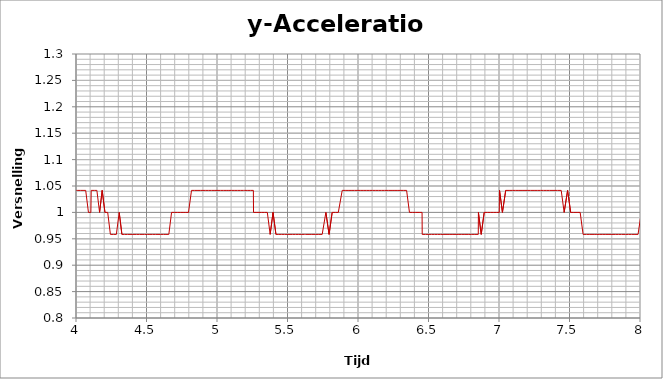
| Category |  y-Acceleration |
|---|---|
| 0.000157 | 1 |
| 0.0130323 | 1 |
| 0.0138545 | 1 |
| 0.0147613 | 1 |
| 0.0156226 | 1 |
| 0.0305647 | 1 |
| 0.0317428 | 1 |
| 0.080701 | 1 |
| 0.0817575 | 1 |
| 0.0826627 | 1 |
| 0.0838849 | 1 |
| 0.1066629 | 1 |
| 0.1076301 | 1 |
| 0.1084358 | 1 |
| 0.1297994 | 1 |
| 0.1304042 | 1 |
| 0.1475201 | 1 |
| 0.1481867 | 1 |
| 0.1748085 | 1 |
| 0.1893385 | 1 |
| 0.2036937 | 1 |
| 0.2206649 | 1.042 |
| 0.2213476 | 1.042 |
| 0.2349119 | 1 |
| 0.2356791 | 1 |
| 0.2512288 | 1 |
| 0.2674596 | 1 |
| 0.2817003 | 1 |
| 0.282387 | 1 |
| 0.2986292 | 1.042 |
| 0.2994668 | 1.042 |
| 0.3148453 | 1 |
| 0.3303498 | 1 |
| 0.3310177 | 1 |
| 0.3447499 | 0.958 |
| 0.3591618 | 1 |
| 0.3598312 | 1 |
| 0.374069 | 1 |
| 0.3896296 | 1 |
| 0.3902931 | 1 |
| 0.4042918 | 1 |
| 0.4211725 | 1 |
| 0.4371692 | 1 |
| 0.4378536 | 1 |
| 0.45218 | 1 |
| 0.4527916 | 1 |
| 0.4707061 | 1 |
| 0.4854508 | 0.958 |
| 0.4860869 | 0.958 |
| 0.500232 | 1 |
| 0.51593 | 1 |
| 0.5165812 | 1 |
| 0.5309185 | 1 |
| 0.5454933 | 1 |
| 0.5461828 | 1 |
| 0.5617739 | 1 |
| 0.5764766 | 1 |
| 0.5770758 | 1 |
| 0.5933145 | 1.042 |
| 0.5944557 | 1.042 |
| 0.6133145 | 1 |
| 0.6165906 | 1 |
| 0.6308497 | 1 |
| 0.6454278 | 1 |
| 0.6461086 | 1 |
| 0.6602964 | 1 |
| 0.6770583 | 1 |
| 0.6918479 | 1 |
| 0.6926751 | 1 |
| 0.7075005 | 1 |
| 0.7218467 | 1 |
| 0.722546 | 1 |
| 0.741728 | 1 |
| 0.7603823 | 1 |
| 0.7611727 | 1 |
| 0.778845 | 1 |
| 0.7795004 | 1 |
| 0.7970225 | 1 |
| 0.8128809 | 1 |
| 0.813536 | 1 |
| 0.8292187 | 1 |
| 0.8298403 | 1 |
| 0.8468428 | 1 |
| 0.8475012 | 1 |
| 0.8644892 | 1.042 |
| 0.8839321 | 1 |
| 0.8998428 | 1 |
| 0.9004683 | 1 |
| 0.9173861 | 1 |
| 0.9180443 | 1 |
| 0.9186312 | 1 |
| 0.9365254 | 1 |
| 0.9538486 | 1 |
| 0.9714944 | 1 |
| 0.97215 | 1 |
| 0.9726741 | 1 |
| 0.9887284 | 1 |
| 1.004109 | 1 |
| 1.004833 | 1 |
| 1.019539 | 1 |
| 1.039704 | 1 |
| 1.055128 | 1 |
| 1.055827 | 1 |
| 1.072471 | 1 |
| 1.073161 | 1 |
| 1.087608 | 1.042 |
| 1.103411 | 1.125 |
| 1.104345 | 1.042 |
| 1.119944 | 1 |
| 1.120658 | 1 |
| 1.138724 | 0.833 |
| 1.15358 | 0.792 |
| 1.154357 | 0.792 |
| 1.16973 | 0.875 |
| 1.184896 | 1.042 |
| 1.185607 | 1.042 |
| 1.200219 | 1 |
| 1.215095 | 0.958 |
| 1.215933 | 0.958 |
| 1.232623 | 1 |
| 1.248011 | 1.042 |
| 1.248747 | 1.042 |
| 1.263709 | 0.958 |
| 1.280249 | 0.833 |
| 1.280929 | 0.833 |
| 1.297589 | 0.875 |
| 1.298311 | 0.875 |
| 1.313588 | 1 |
| 1.328605 | 1.042 |
| 1.347488 | 1.083 |
| 1.348127 | 1.083 |
| 1.364383 | 1.083 |
| 1.416748 | 1 |
| 1.417552 | 1 |
| 1.418429 | 1 |
| 1.418986 | 1 |
| 1.41978 | 0.958 |
| 1.444026 | 1 |
| 1.461211 | 1.042 |
| 1.461885 | 1.042 |
| 1.477198 | 1 |
| 1.493001 | 1 |
| 1.493661 | 1 |
| 1.510857 | 1.083 |
| 1.511567 | 1.083 |
| 1.527287 | 1.083 |
| 1.544806 | 1.083 |
| 1.54545 | 1.083 |
| 1.562417 | 1.083 |
| 1.563148 | 1.083 |
| 1.578958 | 1.042 |
| 1.579871 | 1.042 |
| 1.596834 | 1 |
| 1.612385 | 1 |
| 1.61308 | 1 |
| 1.62893 | 1 |
| 1.646513 | 1.042 |
| 1.647231 | 1.042 |
| 1.66569 | 1.083 |
| 1.666421 | 1.083 |
| 1.68415 | 1.125 |
| 1.684872 | 1.125 |
| 1.701502 | 1.083 |
| 1.717536 | 1.083 |
| 1.718264 | 1.083 |
| 1.733546 | 1.125 |
| 1.749707 | 1.042 |
| 1.75034 | 1.042 |
| 1.768749 | 1.042 |
| 1.769474 | 1.042 |
| 1.78447 | 1.042 |
| 1.785323 | 1.042 |
| 1.800751 | 1.042 |
| 1.818138 | 1.042 |
| 1.818774 | 1.042 |
| 1.842808 | 1.042 |
| 1.844419 | 1.042 |
| 1.860927 | 1.083 |
| 1.861655 | 1.083 |
| 1.877919 | 1.042 |
| 1.894364 | 1.042 |
| 1.911796 | 1 |
| 1.912527 | 1 |
| 1.928363 | 1 |
| 1.928998 | 1 |
| 1.94464 | 1 |
| 1.960958 | 1 |
| 1.961688 | 1 |
| 1.978743 | 0.958 |
| 1.995666 | 0.958 |
| 2.015419 | 0.958 |
| 2.031904 | 1 |
| 2.032643 | 1 |
| 2.033222 | 1 |
| 2.050014 | 1.042 |
| 2.065676 | 1.042 |
| 2.06642 | 1.042 |
| 2.08195 | 1 |
| 2.097949 | 0.958 |
| 2.098683 | 0.958 |
| 2.114168 | 0.958 |
| 2.114917 | 0.958 |
| 2.13076 | 0.958 |
| 2.147383 | 0.958 |
| 2.148031 | 0.958 |
| 2.148772 | 0.958 |
| 2.164773 | 0.958 |
| 2.180937 | 0.958 |
| 2.197473 | 0.958 |
| 2.198219 | 0.958 |
| 2.214992 | 0.958 |
| 2.21572 | 0.958 |
| 2.231684 | 0.958 |
| 2.232334 | 0.958 |
| 2.24842 | 0.958 |
| 2.265454 | 0.958 |
| 2.266127 | 0.958 |
| 2.281806 | 1 |
| 2.284919 | 0.958 |
| 2.301447 | 0.958 |
| 2.302235 | 0.958 |
| 2.318487 | 0.958 |
| 2.335696 | 0.917 |
| 2.336352 | 0.917 |
| 2.352352 | 0.917 |
| 2.370116 | 0.958 |
| 2.37086 | 0.958 |
| 2.387126 | 1 |
| 2.387847 | 1 |
| 2.40489 | 1 |
| 2.422638 | 1 |
| 2.423415 | 1 |
| 2.440013 | 1 |
| 2.440716 | 1 |
| 2.460382 | 1 |
| 2.461234 | 1 |
| 2.477397 | 0.958 |
| 2.478057 | 0.958 |
| 2.495362 | 1 |
| 2.513079 | 1 |
| 2.513907 | 1 |
| 2.529854 | 1 |
| 2.530608 | 1 |
| 2.546742 | 1.042 |
| 2.547492 | 1.042 |
| 2.566957 | 1.042 |
| 2.585251 | 1.042 |
| 2.586825 | 1.042 |
| 2.603565 | 1.042 |
| 2.604293 | 1.042 |
| 2.620711 | 1.042 |
| 2.621409 | 1.042 |
| 2.642312 | 1.042 |
| 2.642974 | 1.042 |
| 2.659744 | 1 |
| 2.660648 | 1 |
| 2.676932 | 1.042 |
| 2.693854 | 1.042 |
| 2.711208 | 1.042 |
| 2.711948 | 1.042 |
| 2.728491 | 1.042 |
| 2.729189 | 1.042 |
| 2.72999 | 1.042 |
| 2.749721 | 1.042 |
| 2.765779 | 1.083 |
| 2.766538 | 1.083 |
| 2.78429 | 1.083 |
| 2.785235 | 1.083 |
| 2.802582 | 1.042 |
| 2.820004 | 1.042 |
| 2.820757 | 1.042 |
| 2.838315 | 1.042 |
| 2.83906 | 1.042 |
| 2.857958 | 1.042 |
| 2.85922 | 1.042 |
| 2.878118 | 1.042 |
| 2.878881 | 1.042 |
| 2.895232 | 1.042 |
| 2.896022 | 1.042 |
| 2.912809 | 1.042 |
| 2.913574 | 1.042 |
| 2.934968 | 1.042 |
| 2.935724 | 1.042 |
| 2.954262 | 1.042 |
| 2.971587 | 1.042 |
| 2.972331 | 1.042 |
| 2.989224 | 1.042 |
| 2.989942 | 1.042 |
| 3.010663 | 1 |
| 3.011401 | 1 |
| 3.028522 | 1 |
| 3.029235 | 1 |
| 3.046254 | 1 |
| 3.064648 | 1 |
| 3.065382 | 1 |
| 3.066173 | 1 |
| 3.082773 | 1 |
| 3.099562 | 1 |
| 3.100331 | 1 |
| 3.117595 | 1 |
| 3.134209 | 1 |
| 3.135003 | 1 |
| 3.156056 | 0.958 |
| 3.156759 | 0.958 |
| 3.17321 | 0.958 |
| 3.19057 | 0.958 |
| 3.191252 | 0.958 |
| 3.192069 | 0.958 |
| 3.209137 | 0.958 |
| 3.210285 | 0.958 |
| 3.227833 | 0.958 |
| 3.24473 | 0.958 |
| 3.245631 | 0.958 |
| 3.262528 | 0.958 |
| 3.279426 | 0.958 |
| 3.281033 | 0.958 |
| 3.281672 | 0.958 |
| 3.299077 | 0.958 |
| 3.316143 | 0.958 |
| 3.316928 | 0.958 |
| 3.334037 | 0.958 |
| 3.334944 | 0.958 |
| 3.351413 | 0.958 |
| 3.352349 | 0.958 |
| 3.37067 | 0.958 |
| 3.388601 | 0.958 |
| 3.38931 | 0.958 |
| 3.40611 | 0.958 |
| 3.406818 | 0.958 |
| 3.424582 | 0.958 |
| 3.444244 | 0.958 |
| 3.445123 | 0.958 |
| 3.445738 | 0.958 |
| 3.465714 | 0.958 |
| 3.482581 | 0.958 |
| 3.483353 | 0.958 |
| 3.500564 | 0.958 |
| 3.501276 | 0.958 |
| 3.519722 | 0.958 |
| 3.539398 | 0.958 |
| 3.540302 | 0.958 |
| 3.540915 | 0.958 |
| 3.559978 | 0.958 |
| 3.579161 | 1 |
| 3.580381 | 1 |
| 3.581137 | 1 |
| 3.597753 | 1 |
| 3.625223 | 1 |
| 3.625918 | 1 |
| 3.627547 | 1 |
| 3.644492 | 1.042 |
| 3.6453 | 1.042 |
| 3.663831 | 1.042 |
| 3.665013 | 1.042 |
| 3.684846 | 1.042 |
| 3.685775 | 1.042 |
| 3.703409 | 1.042 |
| 3.704393 | 1.042 |
| 3.722824 | 1 |
| 3.723596 | 1 |
| 3.740613 | 1.042 |
| 3.741664 | 1.042 |
| 3.758935 | 1.042 |
| 3.760032 | 1.042 |
| 3.778447 | 1.042 |
| 3.796832 | 1.042 |
| 3.797522 | 1.042 |
| 3.819894 | 1.042 |
| 3.82065 | 1.042 |
| 3.837812 | 1.042 |
| 3.838583 | 1.042 |
| 3.857443 | 1.083 |
| 3.858213 | 1.083 |
| 3.881054 | 1.042 |
| 3.881845 | 1.042 |
| 3.899107 | 1.083 |
| 3.899891 | 1.083 |
| 3.916984 | 1.042 |
| 3.917744 | 1.042 |
| 3.934685 | 1.042 |
| 3.93551 | 1.042 |
| 3.955764 | 1.042 |
| 3.973365 | 1.042 |
| 3.97416 | 1.042 |
| 3.993713 | 1.042 |
| 3.994438 | 1.042 |
| 3.995205 | 1.042 |
| 4.013206 | 1.042 |
| 4.030635 | 1.042 |
| 4.031415 | 1.042 |
| 4.049956 | 1.042 |
| 4.051022 | 1.042 |
| 4.068741 | 1.042 |
| 4.0695 | 1.042 |
| 4.088216 | 1 |
| 4.105447 | 1 |
| 4.107793 | 1.042 |
| 4.108654 | 1.042 |
| 4.130109 | 1.042 |
| 4.148132 | 1.042 |
| 4.149065 | 1.042 |
| 4.149712 | 1.042 |
| 4.167305 | 1 |
| 4.185665 | 1.042 |
| 4.20526 | 1 |
| 4.206407 | 1 |
| 4.207035 | 1 |
| 4.224759 | 1 |
| 4.225567 | 1 |
| 4.243977 | 0.958 |
| 4.267578 | 0.958 |
| 4.268363 | 0.958 |
| 4.268986 | 0.958 |
| 4.286287 | 0.958 |
| 4.28707 | 0.958 |
| 4.306435 | 1 |
| 4.307226 | 1 |
| 4.325675 | 0.958 |
| 4.326386 | 0.958 |
| 4.344819 | 0.958 |
| 4.345541 | 0.958 |
| 4.366271 | 0.958 |
| 4.366995 | 0.958 |
| 4.403517 | 0.958 |
| 4.404341 | 0.958 |
| 4.405652 | 0.958 |
| 4.4063 | 0.958 |
| 4.427883 | 0.958 |
| 4.449503 | 0.958 |
| 4.450251 | 0.958 |
| 4.450888 | 0.958 |
| 4.468402 | 0.958 |
| 4.469211 | 0.958 |
| 4.486756 | 0.958 |
| 4.487578 | 0.958 |
| 4.504909 | 0.958 |
| 4.524474 | 0.958 |
| 4.525316 | 0.958 |
| 4.526396 | 0.958 |
| 4.543892 | 0.958 |
| 4.562201 | 0.958 |
| 4.562908 | 0.958 |
| 4.581615 | 0.958 |
| 4.582423 | 0.958 |
| 4.600884 | 0.958 |
| 4.601881 | 0.958 |
| 4.619457 | 0.958 |
| 4.620257 | 0.958 |
| 4.638048 | 0.958 |
| 4.65832 | 0.958 |
| 4.659097 | 0.958 |
| 4.677831 | 1 |
| 4.67858 | 1 |
| 4.699228 | 1 |
| 4.700243 | 1 |
| 4.720562 | 1 |
| 4.7213 | 1 |
| 4.74052 | 1 |
| 4.741324 | 1 |
| 4.759645 | 1 |
| 4.760361 | 1 |
| 4.778962 | 1 |
| 4.779751 | 1 |
| 4.797973 | 1 |
| 4.799537 | 1 |
| 4.819221 | 1.042 |
| 4.820035 | 1.042 |
| 4.83916 | 1.042 |
| 4.839917 | 1.042 |
| 4.858403 | 1.042 |
| 4.859136 | 1.042 |
| 4.881377 | 1.042 |
| 4.882103 | 1.042 |
| 4.900653 | 1.042 |
| 4.90144 | 1.042 |
| 4.919777 | 1.042 |
| 4.920584 | 1.042 |
| 4.939766 | 1.042 |
| 4.940939 | 1.042 |
| 4.960266 | 1.042 |
| 4.961053 | 1.042 |
| 4.979299 | 1.042 |
| 4.980226 | 1.042 |
| 5.000143 | 1.042 |
| 5.000878 | 1.042 |
| 5.024671 | 1.042 |
| 5.025443 | 1.042 |
| 5.044871 | 1.042 |
| 5.04562 | 1.042 |
| 5.064866 | 1.042 |
| 5.06567 | 1.042 |
| 5.084223 | 1.042 |
| 5.085028 | 1.042 |
| 5.10287 | 1.042 |
| 5.103628 | 1.042 |
| 5.121979 | 1.042 |
| 5.122705 | 1.042 |
| 5.144747 | 1.042 |
| 5.14553 | 1.042 |
| 5.167298 | 1.042 |
| 5.168114 | 1.042 |
| 5.187608 | 1.042 |
| 5.188637 | 1.042 |
| 5.197114 | 1.042 |
| 5.218414 | 1.042 |
| 5.219248 | 1.042 |
| 5.238105 | 1.042 |
| 5.238903 | 1.042 |
| 5.257972 | 1.042 |
| 5.258979 | 1 |
| 5.27724 | 1 |
| 5.278026 | 1 |
| 5.297558 | 1 |
| 5.316278 | 1 |
| 5.317111 | 1 |
| 5.337048 | 1 |
| 5.337843 | 1 |
| 5.356832 | 1 |
| 5.357594 | 1 |
| 5.377002 | 0.958 |
| 5.377759 | 0.958 |
| 5.39739 | 1 |
| 5.398128 | 1 |
| 5.418012 | 0.958 |
| 5.418769 | 0.958 |
| 5.438389 | 0.958 |
| 5.439126 | 0.958 |
| 5.45868 | 0.958 |
| 5.459701 | 0.958 |
| 5.479064 | 0.958 |
| 5.479884 | 0.958 |
| 5.498185 | 0.958 |
| 5.499018 | 0.958 |
| 5.517894 | 0.958 |
| 5.518735 | 0.958 |
| 5.536872 | 0.958 |
| 5.557116 | 0.958 |
| 5.557858 | 0.958 |
| 5.558742 | 0.958 |
| 5.579729 | 0.958 |
| 5.601364 | 0.958 |
| 5.602835 | 0.958 |
| 5.603628 | 0.958 |
| 5.621843 | 0.958 |
| 5.622595 | 0.958 |
| 5.629374 | 0.958 |
| 5.65273 | 0.958 |
| 5.653509 | 0.958 |
| 5.672615 | 0.958 |
| 5.673353 | 0.958 |
| 5.697187 | 0.958 |
| 5.69793 | 0.958 |
| 5.700215 | 0.958 |
| 5.722034 | 0.958 |
| 5.722832 | 0.958 |
| 5.746101 | 0.958 |
| 5.746851 | 0.958 |
| 5.772199 | 1 |
| 5.773104 | 1 |
| 5.773765 | 1 |
| 5.794777 | 0.958 |
| 5.795567 | 0.958 |
| 5.816741 | 1 |
| 5.817486 | 1 |
| 5.839787 | 1 |
| 5.840527 | 1 |
| 5.860403 | 1 |
| 5.888032 | 1.042 |
| 5.888844 | 1.042 |
| 5.889525 | 1.042 |
| 5.909011 | 1.042 |
| 5.909825 | 1.042 |
| 5.929931 | 1.042 |
| 5.930673 | 1.042 |
| 5.950912 | 1.042 |
| 5.951652 | 1.042 |
| 5.952309 | 1.042 |
| 5.974918 | 1.042 |
| 5.975712 | 1.042 |
| 5.999461 | 1.042 |
| 6.01999 | 1.042 |
| 6.020863 | 1.042 |
| 6.021535 | 1.042 |
| 6.022191 | 1.042 |
| 6.041307 | 1.042 |
| 6.061412 | 1.042 |
| 6.062691 | 1.042 |
| 6.06336 | 1.042 |
| 6.083338 | 1.042 |
| 6.1035 | 1.042 |
| 6.104356 | 1.042 |
| 6.125735 | 1.042 |
| 6.144604 | 1.042 |
| 6.145654 | 1.042 |
| 6.146361 | 1.042 |
| 6.167295 | 1.042 |
| 6.188922 | 1.042 |
| 6.189829 | 1.042 |
| 6.21809 | 1.042 |
| 6.219093 | 1.042 |
| 6.219793 | 1.042 |
| 6.220485 | 1.042 |
| 6.241552 | 1.042 |
| 6.242398 | 1.042 |
| 6.261992 | 1.042 |
| 6.262827 | 1.042 |
| 6.282947 | 1.042 |
| 6.283689 | 1.042 |
| 6.304291 | 1.042 |
| 6.305122 | 1.042 |
| 6.324334 | 1.042 |
| 6.325138 | 1.042 |
| 6.344712 | 1.042 |
| 6.364937 | 1 |
| 6.365697 | 1 |
| 6.366364 | 1 |
| 6.386632 | 1 |
| 6.387511 | 1 |
| 6.409264 | 1 |
| 6.410188 | 1 |
| 6.433309 | 1 |
| 6.434083 | 1 |
| 6.434753 | 1 |
| 6.454388 | 1 |
| 6.45544 | 0.958 |
| 6.47816 | 0.958 |
| 6.478906 | 0.958 |
| 6.498878 | 0.958 |
| 6.499648 | 0.958 |
| 6.521689 | 0.958 |
| 6.522528 | 0.958 |
| 6.542589 | 0.958 |
| 6.544005 | 0.958 |
| 6.56453 | 0.958 |
| 6.565321 | 0.958 |
| 6.586739 | 0.958 |
| 6.587593 | 0.958 |
| 6.588263 | 0.958 |
| 6.609713 | 0.958 |
| 6.610753 | 0.958 |
| 6.631393 | 0.958 |
| 6.632242 | 0.958 |
| 6.651785 | 0.958 |
| 6.652624 | 0.958 |
| 6.673265 | 0.958 |
| 6.674095 | 0.958 |
| 6.675177 | 0.958 |
| 6.695563 | 0.958 |
| 6.71562 | 0.958 |
| 6.716464 | 0.958 |
| 6.735847 | 0.958 |
| 6.736808 | 0.958 |
| 6.7376 | 0.958 |
| 6.758282 | 0.958 |
| 6.759253 | 0.958 |
| 6.781522 | 0.958 |
| 6.782327 | 0.958 |
| 6.80303 | 0.958 |
| 6.803952 | 0.958 |
| 6.828764 | 0.958 |
| 6.829643 | 0.958 |
| 6.830655 | 0.958 |
| 6.852964 | 0.958 |
| 6.853986 | 1 |
| 6.873996 | 0.958 |
| 6.874903 | 0.958 |
| 6.894958 | 1 |
| 6.895891 | 1 |
| 6.918179 | 1 |
| 6.918981 | 1 |
| 6.939601 | 1 |
| 6.940451 | 1 |
| 6.941217 | 1 |
| 6.962089 | 1 |
| 6.981559 | 1 |
| 6.982437 | 1 |
| 7.001933 | 1 |
| 7.002944 | 1 |
| 7.003838 | 1.042 |
| 7.02434 | 1 |
| 7.047642 | 1.042 |
| 7.048412 | 1.042 |
| 7.049093 | 1.042 |
| 7.071685 | 1.042 |
| 7.072466 | 1.042 |
| 7.094075 | 1.042 |
| 7.094873 | 1.042 |
| 7.115374 | 1.042 |
| 7.116369 | 1.042 |
| 7.117063 | 1.042 |
| 7.141192 | 1.042 |
| 7.142173 | 1.042 |
| 7.163443 | 1.042 |
| 7.164344 | 1.042 |
| 7.184338 | 1.042 |
| 7.185201 | 1.042 |
| 7.204545 | 1.042 |
| 7.205386 | 1.042 |
| 7.224762 | 1.042 |
| 7.225632 | 1.042 |
| 7.227122 | 1.042 |
| 7.25483 | 1.042 |
| 7.27486 | 1.042 |
| 7.275685 | 1.042 |
| 7.2951 | 1.042 |
| 7.295934 | 1.042 |
| 7.315338 | 1.042 |
| 7.316212 | 1.042 |
| 7.335604 | 1.042 |
| 7.336493 | 1.042 |
| 7.357227 | 1.042 |
| 7.358108 | 1.042 |
| 7.415504 | 1.042 |
| 7.41635 | 1.042 |
| 7.417137 | 1.042 |
| 7.417878 | 1.042 |
| 7.418573 | 1.042 |
| 7.419265 | 1.042 |
| 7.420125 | 1.042 |
| 7.441191 | 1.042 |
| 7.462018 | 1 |
| 7.462891 | 1 |
| 7.46505 | 1 |
| 7.486552 | 1.042 |
| 7.487677 | 1.042 |
| 7.508411 | 1 |
| 7.509204 | 1 |
| 7.530529 | 1 |
| 7.553674 | 1 |
| 7.554492 | 1 |
| 7.575611 | 1 |
| 7.596473 | 0.958 |
| 7.597404 | 0.958 |
| 7.620387 | 0.958 |
| 7.621205 | 0.958 |
| 7.644223 | 0.958 |
| 7.645094 | 0.958 |
| 7.645797 | 0.958 |
| 7.674718 | 0.958 |
| 7.694371 | 0.958 |
| 7.715415 | 0.958 |
| 7.716331 | 0.958 |
| 7.736261 | 0.958 |
| 7.737131 | 0.958 |
| 7.73783 | 0.958 |
| 7.757978 | 0.958 |
| 7.758766 | 0.958 |
| 7.779949 | 0.958 |
| 7.780733 | 0.958 |
| 7.80096 | 0.958 |
| 7.824402 | 0.958 |
| 7.848804 | 0.958 |
| 7.868701 | 0.958 |
| 7.869561 | 0.958 |
| 7.896945 | 0.958 |
| 7.897819 | 0.958 |
| 7.919187 | 0.958 |
| 7.94062 | 0.958 |
| 7.941843 | 0.958 |
| 7.942554 | 0.958 |
| 7.964232 | 0.958 |
| 7.96513 | 0.958 |
| 7.986062 | 0.958 |
| 7.98695 | 0.958 |
| 7.987648 | 0.958 |
| 8.009363 | 1 |
| 8.010259 | 1 |
| 8.03282 | 1 |
| 8.03361 | 1 |
| 8.055746 | 1 |
| 8.075994 | 1 |
| 8.076844 | 1 |
| 8.097429 | 1 |
| 8.098336 | 1 |
| 8.09904 | 1 |
| 8.122851 | 1.042 |
| 8.123691 | 1.042 |
| 8.14545 | 1 |
| 8.146273 | 1 |
| 8.170087 | 1 |
| 8.170996 | 1.042 |
| 8.171743 | 1.042 |
| 8.192265 | 1.042 |
| 8.193094 | 1.042 |
| 8.217548 | 1.042 |
| 8.218979 | 1.042 |
| 8.225665 | 1.042 |
| 8.246264 | 1.042 |
| 8.247145 | 1.042 |
| 8.268166 | 1.042 |
| 8.269043 | 1.042 |
| 8.289189 | 1.042 |
| 8.290006 | 1.042 |
| 8.290888 | 1.042 |
| 8.311603 | 1.042 |
| 8.333431 | 1.042 |
| 8.334709 | 1.042 |
| 8.356506 | 1.042 |
| 8.357308 | 1.042 |
| 8.358027 | 1.042 |
| 8.38028 | 1.042 |
| 8.381134 | 1.042 |
| 8.403143 | 1.042 |
| 8.403994 | 1.042 |
| 8.425616 | 1.042 |
| 8.426413 | 1.042 |
| 8.427123 | 1.042 |
| 8.450503 | 1.042 |
| 8.451347 | 1.042 |
| 8.472926 | 1.042 |
| 8.473933 | 1.042 |
| 8.495297 | 1.042 |
| 8.496445 | 1.042 |
| 8.497171 | 1.042 |
| 8.518669 | 1.042 |
| 8.519661 | 1.042 |
| 8.540457 | 1 |
| 8.541456 | 1 |
| 8.563295 | 1 |
| 8.56421 | 1 |
| 8.58477 | 1.042 |
| 8.585668 | 1.042 |
| 8.607051 | 1.042 |
| 8.62757 | 1 |
| 8.62847 | 1 |
| 8.650065 | 1 |
| 8.651062 | 1 |
| 8.651777 | 1 |
| 8.652502 | 1 |
| 8.674283 | 1 |
| 8.675279 | 1 |
| 8.696792 | 1 |
| 8.697698 | 1 |
| 8.719435 | 1 |
| 8.720323 | 1 |
| 8.721296 | 1 |
| 8.743262 | 0.958 |
| 8.744322 | 0.958 |
| 8.766869 | 0.958 |
| 8.767721 | 0.958 |
| 8.789951 | 0.958 |
| 8.790766 | 0.958 |
| 8.811978 | 0.958 |
| 8.812861 | 0.958 |
| 8.813763 | 0.958 |
| 8.835151 | 0.958 |
| 8.835993 | 0.958 |
| 8.857658 | 0.958 |
| 8.858565 | 0.958 |
| 8.879795 | 0.958 |
| 8.880694 | 0.958 |
| 8.902083 | 0.958 |
| 8.9032 | 0.958 |
| 8.92488 | 0.958 |
| 8.925762 | 0.958 |
| 8.926486 | 0.958 |
| 8.946853 | 0.958 |
| 8.947767 | 0.958 |
| 8.969067 | 0.958 |
| 8.970021 | 0.958 |
| 8.991423 | 0.958 |
| 8.992284 | 0.958 |
| 9.014674 | 0.958 |
| 9.015615 | 0.958 |
| 9.037291 | 0.958 |
| 9.03811 | 0.958 |
| 9.038852 | 0.958 |
| 9.060625 | 0.958 |
| 9.06144 | 0.958 |
| 9.084375 | 0.958 |
| 9.085818 | 0.958 |
| 9.107171 | 0.958 |
| 9.128496 | 1 |
| 9.129485 | 1 |
| 9.130212 | 1 |
| 9.152949 | 0.958 |
| 9.175364 | 1 |
| 9.176265 | 1 |
| 9.196922 | 1 |
| 9.19783 | 1 |
| 9.21861 | 1 |
| 9.219499 | 1 |
| 9.220224 | 1 |
| 9.242132 | 1 |
| 9.242979 | 1 |
| 9.264615 | 1.042 |
| 9.265512 | 1.042 |
| 9.286989 | 1.042 |
| 9.288233 | 1.042 |
| 9.288983 | 1.042 |
| 9.310724 | 1.042 |
| 9.311646 | 1.042 |
| 9.33285 | 1.042 |
| 9.333752 | 1.042 |
| 9.355865 | 1.042 |
| 9.356766 | 1.042 |
| 9.378445 | 1.042 |
| 9.379268 | 1.042 |
| 9.400279 | 1.042 |
| 9.40252 | 1.042 |
| 9.403686 | 1.042 |
| 9.424966 | 1.042 |
| 9.425862 | 1.042 |
| 9.44797 | 1.042 |
| 9.44899 | 1.042 |
| 9.471439 | 1.042 |
| 9.472272 | 1.042 |
| 9.495093 | 1.042 |
| 9.495932 | 1.042 |
| 9.496685 | 1.042 |
| 9.519795 | 1.042 |
| 9.520618 | 1.042 |
| 9.54389 | 1.042 |
| 9.544954 | 1.042 |
| 9.545711 | 1.042 |
| 9.567019 | 1.042 |
| 9.568037 | 1.042 |
| 9.588864 | 1.042 |
| 9.617723 | 1.042 |
| 9.640993 | 1.042 |
| 9.641914 | 1.042 |
| 9.664048 | 1 |
| 9.665034 | 1 |
| 9.687193 | 1 |
| 9.688102 | 1 |
| 9.709072 | 1 |
| 9.709995 | 1 |
| 9.73104 | 1 |
| 9.753627 | 1 |
| 9.754526 | 1 |
| 9.777124 | 1 |
| 9.778083 | 1 |
| 9.800735 | 1 |
| 9.801738 | 1 |
| 9.802837 | 1 |
| 9.823923 | 1 |
| 9.824875 | 1 |
| 9.846836 | 1 |
| 9.847749 | 1 |
| 9.869922 | 0.958 |
| 9.870907 | 0.958 |
| 9.89371 | 0.958 |
| 9.894626 | 0.958 |
| 9.895406 | 0.958 |
| 9.917425 | 0.958 |
| 9.918465 | 0.958 |
| 9.94087 | 0.958 |
| 9.941788 | 0.958 |
| 9.970709 | 0.958 |
| 9.992009 | 0.958 |
| 9.992986 | 0.958 |
| 10.02372 | 0.958 |
| 10.04571 | 0.958 |
| 10.04662 | 0.958 |
| 10.06776 | 0.958 |
| 10.06868 | 0.958 |
| 10.09078 | 0.958 |
| 10.09162 | 0.958 |
| 10.11531 | 0.958 |
| 10.11617 | 0.958 |
| 10.11693 | 0.958 |
| 10.13831 | 0.958 |
| 10.15979 | 0.958 |
| 10.16074 | 0.958 |
| 10.16148 | 0.958 |
| 10.19182 | 1 |
| 10.19274 | 1 |
| 10.1945 | 1 |
| 10.22077 | 0.958 |
| 10.22169 | 0.958 |
| 10.22245 | 0.958 |
| 10.24484 | 0.958 |
| 10.24597 | 1 |
| 10.24673 | 1 |
| 10.26873 | 1 |
| 10.26968 | 1 |
| 10.29155 | 1 |
| 10.29251 | 1 |
| 10.31456 | 1 |
| 10.31552 | 1 |
| 10.33721 | 1 |
| 10.36024 | 1 |
| 10.36109 | 1 |
| 10.41971 | 1 |
| 10.42077 | 1 |
| 10.42152 | 1 |
| 10.42227 | 1 |
| 10.4446 | 1.042 |
| 10.44557 | 1.042 |
| 10.47162 | 1.042 |
| 10.47246 | 1.042 |
| 10.4732 | 1.042 |
| 10.49623 | 1.042 |
| 10.4971 | 1.042 |
| 10.5194 | 1.042 |
| 10.52054 | 1.042 |
| 10.54409 | 1.042 |
| 10.54496 | 1.042 |
| 10.54589 | 1.042 |
| 10.56777 | 1.042 |
| 10.56881 | 1.042 |
| 10.59071 | 1.042 |
| 10.59188 | 1.042 |
| 10.61506 | 1.042 |
| 10.61608 | 1.042 |
| 10.61684 | 1.042 |
| 10.63913 | 1.042 |
| 10.64005 | 1.042 |
| 10.66216 | 1.042 |
| 10.66304 | 1.042 |
| 10.66398 | 1.042 |
| 10.68706 | 1.042 |
| 10.6879 | 1.042 |
| 10.71069 | 1.042 |
| 10.71167 | 1.042 |
| 10.73339 | 1.042 |
| 10.73428 | 1.042 |
| 10.75766 | 1.042 |
| 10.75872 | 1.042 |
| 10.75951 | 1.042 |
| 10.78139 | 1 |
| 10.78363 | 1 |
| 10.80663 | 1 |
| 10.80756 | 1 |
| 10.82967 | 1.042 |
| 10.83063 | 1.042 |
| 10.85345 | 1 |
| 10.85438 | 1 |
| 10.85517 | 1 |
| 10.87895 | 1 |
| 10.8798 | 1 |
| 10.90242 | 1 |
| 10.90337 | 1 |
| 10.90413 | 1 |
| 10.92688 | 1 |
| 10.92776 | 1 |
| 10.95129 | 1 |
| 10.95225 | 1 |
| 10.95302 | 1 |
| 10.97571 | 0.958 |
| 10.97659 | 0.958 |
| 10.99986 | 0.958 |
| 11.00071 | 0.958 |
| 11.02401 | 0.958 |
| 11.02492 | 0.958 |
| 11.0257 | 0.958 |
| 11.04858 | 0.958 |
| 11.04954 | 0.958 |
| 11.07176 | 0.958 |
| 11.07312 | 0.958 |
| 11.07393 | 0.958 |
| 11.0968 | 0.958 |
| 11.09775 | 0.958 |
| 11.12137 | 0.958 |
| 11.12237 | 0.958 |
| 11.14523 | 0.958 |
| 11.14627 | 0.958 |
| 11.14738 | 0.958 |
| 11.17126 | 0.958 |
| 11.17221 | 0.958 |
| 11.19664 | 0.958 |
| 11.1979 | 0.958 |
| 11.19883 | 0.958 |
| 11.22275 | 0.958 |
| 11.22368 | 0.958 |
| 11.24642 | 0.958 |
| 11.24728 | 0.958 |
| 11.27229 | 0.958 |
| 11.27325 | 0.958 |
| 11.27424 | 0.958 |
| 11.29719 | 0.958 |
| 11.2981 | 0.958 |
| 11.29918 | 0.958 |
| 11.32271 | 0.958 |
| 11.32415 | 0.958 |
| 11.34762 | 0.958 |
| 11.34868 | 0.958 |
| 11.37292 | 1 |
| 11.37409 | 1 |
| 11.3749 | 1 |
| 11.39932 | 1 |
| 11.40064 | 1 |
| 11.40147 | 1 |
| 11.42549 | 1 |
| 11.42647 | 1 |
| 11.45234 | 1.042 |
| 11.45343 | 1.042 |
| 11.45428 | 1.042 |
| 11.47949 | 1 |
| 11.48041 | 1 |
| 11.50371 | 1 |
| 11.50493 | 1.042 |
| 11.50571 | 1.042 |
| 11.52924 | 1.042 |
| 11.53033 | 1.042 |
| 11.55401 | 1.042 |
| 11.55547 | 1.042 |
| 11.55626 | 1.042 |
| 11.57961 | 1.042 |
| 11.58056 | 1.042 |
| 11.60316 | 1.042 |
| 11.60413 | 1.042 |
| 11.6273 | 1.042 |
| 11.62827 | 1.042 |
| 11.62925 | 1.042 |
| 11.65253 | 1.042 |
| 11.65349 | 1.042 |
| 11.68049 | 1.042 |
| 11.70335 | 1.042 |
| 11.70432 | 1.042 |
| 11.72687 | 1.042 |
| 11.72783 | 1.042 |
| 11.75106 | 1.042 |
| 11.75194 | 1.042 |
| 11.75273 | 1.042 |
| 11.77639 | 1.042 |
| 11.77738 | 1.042 |
| 11.80164 | 1.042 |
| 11.80255 | 1.042 |
| 11.80335 | 1.042 |
| 11.82712 | 1.042 |
| 11.82829 | 1.042 |
| 11.82908 | 1.042 |
| 11.85231 | 1.042 |
| 11.85332 | 1.042 |
| 11.87646 | 1.042 |
| 11.8774 | 1.042 |
| 11.90128 | 1 |
| 11.90233 | 1 |
| 11.90312 | 1 |
| 11.9256 | 1 |
| 11.94834 | 1 |
| 11.94931 | 1 |
| 11.95009 | 1 |
| 11.98571 | 1 |
| 12.00919 | 1 |
| 12.01022 | 1 |
| 12.01119 | 1 |
| 12.01213 | 1 |
| 12.03475 | 1 |
| 12.03585 | 1 |
| 12.0588 | 1 |
| 12.05978 | 1 |
| 12.08385 | 0.958 |
| 12.08486 | 0.958 |
| 12.08583 | 1 |
| 12.10864 | 0.958 |
| 12.10962 | 0.958 |
| 12.13278 | 0.958 |
| 12.13521 | 1 |
| 12.13622 | 1 |
| 12.15955 | 0.958 |
| 12.18347 | 0.958 |
| 12.18449 | 0.958 |
| 12.1853 | 0.958 |
| 12.20942 | 0.958 |
| 12.21064 | 0.958 |
| 12.23462 | 0.958 |
| 12.23556 | 0.958 |
| 12.25999 | 0.958 |
| 12.2837 | 0.958 |
| 12.28472 | 0.958 |
| 12.30948 | 0.958 |
| 12.31045 | 0.958 |
| 12.33408 | 0.958 |
| 12.33509 | 0.958 |
| 12.33605 | 0.958 |
| 12.33684 | 0.958 |
| 12.35995 | 0.958 |
| 12.36098 | 0.958 |
| 12.3836 | 0.958 |
| 12.38463 | 0.958 |
| 12.40834 | 0.958 |
| 12.40929 | 0.958 |
| 12.41016 | 0.958 |
| 12.43487 | 0.958 |
| 12.4359 | 0.958 |
| 12.46066 | 0.958 |
| 12.46164 | 0.958 |
| 12.46245 | 0.958 |
| 12.48879 | 1 |
| 12.48977 | 1 |
| 12.51327 | 1 |
| 12.53853 | 1 |
| 12.53979 | 1 |
| 12.54061 | 1 |
| 12.54157 | 1 |
| 12.56504 | 1 |
| 12.56603 | 1 |
| 12.59871 | 1 |
| 12.62236 | 1.042 |
| 12.62334 | 1.042 |
| 12.62419 | 1.042 |
| 12.64907 | 1 |
| 12.65009 | 1 |
| 12.67299 | 1.042 |
| 12.674 | 1.042 |
| 12.69892 | 1.042 |
| 12.69995 | 1.042 |
| 12.70075 | 1.042 |
| 12.73623 | 1.042 |
| 12.73745 | 1.042 |
| 12.73837 | 1.042 |
| 12.73921 | 1.042 |
| 12.7651 | 1.042 |
| 12.76605 | 1.042 |
| 12.76703 | 0.958 |
| 12.79083 | 1.042 |
| 12.79173 | 1.042 |
| 12.8155 | 1.042 |
| 12.8165 | 1.042 |
| 12.81744 | 1.042 |
| 12.84129 | 1.042 |
| 12.84225 | 1.042 |
| 12.86739 | 1.042 |
| 12.86831 | 1.042 |
| 12.86913 | 1.042 |
| 12.89308 | 1.042 |
| 12.89404 | 1.042 |
| 12.91943 | 1.042 |
| 12.92059 | 1.042 |
| 12.9214 | 1.042 |
| 12.94601 | 1.042 |
| 12.947 | 1.042 |
| 12.97061 | 1.042 |
| 12.97165 | 1.042 |
| 13.00139 | 1.042 |
| 13.00236 | 1.042 |
| 13.00317 | 1.042 |
| 13.02732 | 1 |
| 13.02833 | 1 |
| 13.02932 | 1 |
| 13.05473 | 1 |
| 13.05563 | 1 |
| 13.08035 | 1 |
| 13.08136 | 1 |
| 13.08225 | 1 |
| 13.10706 | 1 |
| 13.10802 | 1 |
| 13.13198 | 1 |
| 13.1335 | 1 |
| 13.13432 | 1 |
| 13.15858 | 1 |
| 13.15987 | 1 |
| 13.18541 | 0.958 |
| 13.18647 | 0.958 |
| 13.18729 | 0.958 |
| 13.21167 | 0.958 |
| 13.21291 | 0.958 |
| 13.21374 | 0.958 |
| 13.2389 | 0.958 |
| 13.2398 | 0.958 |
| 13.26373 | 0.958 |
| 13.26501 | 0.958 |
| 13.26603 | 0.958 |
| 13.29126 | 0.958 |
| 13.29231 | 0.958 |
| 13.31689 | 0.958 |
| 13.31789 | 0.958 |
| 13.31872 | 0.958 |
| 13.34594 | 0.958 |
| 13.34702 | 0.958 |
| 13.34813 | 0.958 |
| 13.40802 | 1 |
| 13.40966 | 0.958 |
| 13.41051 | 0.958 |
| 13.41137 | 0.958 |
| 13.41218 | 0.958 |
| 13.41299 | 0.958 |
| 13.4372 | 0.958 |
| 13.43811 | 0.958 |
| 13.46278 | 0.958 |
| 13.46379 | 0.958 |
| 13.46464 | 0.958 |
| 13.48887 | 0.958 |
| 13.48988 | 0.958 |
| 13.4907 | 0.958 |
| 13.51621 | 0.958 |
| 13.5173 | 0.958 |
| 13.54308 | 0.958 |
| 13.5446 | 0.958 |
| 13.54551 | 0.958 |
| 13.57025 | 0.958 |
| 13.57143 | 0.958 |
| 13.57227 | 0.958 |
| 13.59675 | 1 |
| 13.59779 | 1 |
| 13.5987 | 1 |
| 13.62255 | 1 |
| 13.62361 | 1 |
| 13.64792 | 1 |
| 13.64883 | 1 |
| 13.67364 | 1 |
| 13.6747 | 1 |
| 13.6766 | 1 |
| 13.70115 | 1.042 |
| 13.7026 | 1.042 |
| 13.70343 | 1.042 |
| 13.72788 | 1.042 |
| 13.72891 | 1.042 |
| 13.75409 | 1 |
| 13.75527 | 1 |
| 13.75622 | 1 |
| 13.78139 | 1 |
| 13.7824 | 1 |
| 13.80745 | 1.042 |
| 13.80848 | 1.042 |
| 13.80957 | 1.042 |
| 13.834 | 1.042 |
| 13.83496 | 1.042 |
| 13.83579 | 1.042 |
| 13.86021 | 1.042 |
| 13.86122 | 1.042 |
| 13.88763 | 1.042 |
| 13.88867 | 1.042 |
| 13.88971 | 1.042 |
| 13.91535 | 1.042 |
| 13.91634 | 1.042 |
| 13.91717 | 1.042 |
| 13.94167 | 1.042 |
| 13.94265 | 1.042 |
| 13.94383 | 1.042 |
| 13.96886 | 1.042 |
| 13.96992 | 1.042 |
| 13.99501 | 1.042 |
| 13.99658 | 1.042 |
| 14.02169 | 1.042 |
| 14.02516 | 1.042 |
| 14.02633 | 1.042 |
| 14.05093 | 1.042 |
| 14.05191 | 1.042 |
| 14.05275 | 1.042 |
| 14.07817 | 1.042 |
| 14.07913 | 1.042 |
| 14.07997 | 1.042 |
| 14.1062 | 1 |
| 14.10723 | 1 |
| 14.13277 | 1.042 |
| 14.13394 | 1.042 |
| 14.13482 | 1.042 |
| 14.15946 | 1 |
| 14.1605 | 1 |
| 14.18645 | 1 |
| 14.18746 | 1 |
| 14.18829 | 1 |
| 14.21244 | 1 |
| 14.21346 | 1 |
| 14.23853 | 1 |
| 14.26502 | 1 |
| 14.26621 | 1 |
| 14.29056 | 1 |
| 14.29155 | 1 |
| 14.31718 | 1 |
| 14.31822 | 1 |
| 14.31907 | 1 |
| 14.344 | 0.958 |
| 14.34563 | 0.958 |
| 14.34647 | 0.958 |
| 14.37264 | 0.958 |
| 14.37498 | 0.958 |
| 14.37601 | 0.958 |
| 14.40113 | 0.958 |
| 14.40207 | 0.958 |
| 14.42901 | 0.958 |
| 14.42998 | 0.958 |
| 14.43095 | 0.958 |
| 14.45668 | 0.958 |
| 14.45769 | 0.958 |
| 14.45852 | 0.958 |
| 14.48371 | 0.958 |
| 14.48505 | 0.958 |
| 14.51169 | 0.958 |
| 14.51331 | 0.958 |
| 14.51416 | 0.958 |
| 14.5397 | 0.958 |
| 14.54081 | 0.958 |
| 14.54167 | 0.958 |
| 14.5683 | 0.958 |
| 14.56933 | 0.958 |
| 14.57017 | 0.958 |
| 14.59543 | 0.958 |
| 14.59656 | 0.958 |
| 14.62226 | 0.958 |
| 14.62329 | 0.958 |
| 14.62413 | 0.958 |
| 14.65009 | 0.958 |
| 14.65114 | 0.958 |
| 14.67692 | 0.958 |
| 14.67809 | 0.958 |
| 14.67895 | 0.958 |
| 14.67985 | 0.958 |
| 14.70441 | 0.958 |
| 14.70546 | 0.958 |
| 14.73178 | 1 |
| 14.73309 | 1 |
| 14.73393 | 1 |
| 14.76272 | 1 |
| 14.78852 | 1 |
| 14.78949 | 1 |
| 14.79034 | 1 |
| 14.79135 | 1 |
| 14.82971 | 1 |
| 14.85444 | 1.042 |
| 14.85541 | 1.042 |
| 14.85636 | 1.042 |
| 14.88209 | 1.042 |
| 14.88312 | 1.042 |
| 14.90919 | 1 |
| 14.91014 | 1 |
| 14.91147 | 1.042 |
| 14.91235 | 1.042 |
| 14.93883 | 1.042 |
| 14.93981 | 1.042 |
| 14.96533 | 1.042 |
| 14.96654 | 1.042 |
| 14.9674 | 1.042 |
| 14.99287 | 1.042 |
| 14.99501 | 1.042 |
| 14.99588 | 1.042 |
| 15.02341 | 1.042 |
| 15.02479 | 1.042 |
| 15.02597 | 1.042 |
| 15.05271 | 1.042 |
| 15.05372 | 1.042 |
| 15.08174 | 1.042 |
| 15.08298 | 1.042 |
| 15.08512 | 1.042 |
| 15.1139 | 1.042 |
| 15.11492 | 1.042 |
| 15.1159 | 1.042 |
| 15.1433 | 1.042 |
| 15.14449 | 1.042 |
| 15.14536 | 1.042 |
| 15.17204 | 1.042 |
| 15.1731 | 1.042 |
| 15.17413 | 1.042 |
| 15.19981 | 1.042 |
| 15.20075 | 1.042 |
| 15.20162 | 1.042 |
| 15.2273 | 1.042 |
| 15.22832 | 1.042 |
| 15.25476 | 1.042 |
| 15.25583 | 1.042 |
| 15.25669 | 1.042 |
| 15.2819 | 1 |
| 15.28296 | 1 |
| 15.28381 | 1 |
| 15.30908 | 1 |
| 15.31003 | 1 |
| 15.31104 | 1 |
| 15.3365 | 1 |
| 15.33755 | 1 |
| 15.36345 | 1 |
| 15.36451 | 1 |
| 15.36583 | 1 |
| 15.39185 | 1 |
| 15.39327 | 1 |
| 15.42085 | 0.958 |
| 15.42191 | 0.958 |
| 15.42276 | 0.958 |
| 15.45039 | 0.958 |
| 15.45145 | 0.958 |
| 15.4523 | 0.958 |
| 15.48508 | 0.958 |
| 15.48634 | 1 |
| 15.48773 | 1 |
| 15.48864 | 1 |
| 15.51557 | 0.958 |
| 15.51652 | 0.958 |
| 15.51739 | 0.958 |
| 15.54318 | 0.958 |
| 15.5444 | 0.958 |
| 15.57024 | 0.958 |
| 15.5712 | 0.958 |
| 15.57207 | 0.958 |
| 15.59787 | 0.958 |
| 15.59883 | 0.958 |
| 15.59972 | 0.958 |
| 15.62456 | 0.958 |
| 15.62589 | 0.958 |
| 15.65141 | 0.958 |
| 15.65248 | 0.958 |
| 15.65334 | 0.958 |
| 15.67889 | 0.958 |
| 15.67998 | 0.958 |
| 15.6813 | 0.958 |
| 15.70697 | 0.958 |
| 15.70804 | 0.958 |
| 15.73377 | 0.958 |
| 15.73491 | 0.958 |
| 15.73579 | 0.958 |
| 15.76561 | 1 |
| 15.76664 | 1 |
| 15.76767 | 1 |
| 15.79495 | 0.958 |
| 15.796 | 0.958 |
| 15.79687 | 0.958 |
| 15.82254 | 0.958 |
| 15.82368 | 0.958 |
| 15.82455 | 0.958 |
| 15.84949 | 1 |
| 15.85058 | 1 |
| 15.87742 | 1 |
| 15.87848 | 1 |
| 15.87935 | 1 |
| 15.90522 | 1 |
| 15.90619 | 1 |
| 15.90709 | 1 |
| 15.93235 | 1 |
| 15.93336 | 1 |
| 15.95946 | 1 |
| 15.96051 | 1 |
| 15.96153 | 1 |
| 15.98726 | 1 |
| 15.98824 | 1 |
| 15.98913 | 1 |
| 16.01563 | 1 |
| 16.01669 | 1 |
| 16.01756 | 1 |
| 16.0433 | 1.042 |
| 16.04442 | 1.042 |
| 16.06982 | 1.042 |
| 16.07084 | 1.042 |
| 16.07171 | 1.042 |
| 16.09706 | 1.042 |
| 16.10014 | 1.042 |
| 16.10132 | 1.042 |
| 16.12621 | 1.042 |
| 16.1273 | 1.042 |
| 16.15311 | 1.042 |
| 16.15418 | 1.042 |
| 16.15505 | 1.042 |
| 16.17966 | 1.042 |
| 16.18074 | 1.042 |
| 16.1818 | 1.042 |
| 16.20686 | 1.042 |
| 16.20796 | 1.042 |
| 16.2339 | 1.042 |
| 16.23504 | 1.042 |
| 16.23592 | 1.042 |
| 16.26178 | 1.042 |
| 16.26285 | 1.042 |
| 16.28911 | 1.042 |
| 16.29011 | 1.042 |
| 16.29131 | 1.042 |
| 16.31792 | 1.042 |
| 16.31896 | 1.042 |
| 16.31985 | 1.042 |
| 16.34517 | 1.042 |
| 16.3464 | 1 |
| 16.34728 | 1 |
| 16.40957 | 1 |
| 16.41065 | 1 |
| 16.41181 | 1 |
| 16.41291 | 1 |
| 16.4138 | 1 |
| 16.43938 | 1 |
| 16.4405 | 1 |
| 16.44139 | 1 |
| 16.46746 | 1 |
| 16.46996 | 1 |
| 16.4714 | 1 |
| 16.49754 | 1 |
| 16.49872 | 1 |
| 16.49961 | 1 |
| 16.52539 | 1 |
| 16.52646 | 1 |
| 16.55197 | 0.958 |
| 16.55307 | 0.958 |
| 16.55395 | 0.958 |
| 16.55791 | 0.958 |
| 16.58582 | 0.958 |
| 16.58692 | 0.958 |
| 16.58781 | 0.958 |
| 16.61885 | 0.958 |
| 16.61994 | 0.958 |
| 16.62435 | 0.958 |
| 16.65544 | 0.958 |
| 16.65648 | 0.958 |
| 16.65742 | 0.958 |
| 16.68738 | 0.958 |
| 16.68897 | 0.958 |
| 16.68997 | 0.958 |
| 16.69096 | 0.958 |
| 16.72058 | 0.958 |
| 16.7221 | 0.958 |
| 16.75007 | 0.958 |
| 16.75112 | 0.958 |
| 16.75232 | 0.958 |
| 16.7533 | 0.958 |
| 16.7822 | 0.958 |
| 16.78365 | 0.958 |
| 16.78454 | 0.958 |
| 16.81181 | 0.958 |
| 16.8128 | 0.958 |
| 16.84034 | 0.958 |
| 16.84148 | 0.958 |
| 16.86761 | 0.958 |
| 16.86868 | 0.958 |
| 16.86972 | 0.958 |
| 16.87084 | 0.958 |
| 16.89803 | 0.958 |
| 16.89912 | 0.958 |
| 16.92612 | 0.958 |
| 16.9272 | 0.958 |
| 16.92809 | 0.958 |
| 16.95603 | 1 |
| 16.95714 | 1 |
| 16.95808 | 1 |
| 16.968 | 1 |
| 16.9936 | 1 |
| 16.99466 | 1 |
| 16.99878 | 1 |
| 17.02758 | 1 |
| 17.02863 | 1 |
| 17.05791 | 1 |
| 17.05986 | 1 |
| 17.08559 | 1 |
| 17.08666 | 1 |
| 17.09098 | 1 |
| 17.11963 | 1 |
| 17.12093 | 1 |
| 17.12188 | 1 |
| 17.15767 | 1.042 |
| 17.15892 | 1.042 |
| 17.15983 | 1.042 |
| 17.16103 | 1 |
| 17.18642 | 1.042 |
| 17.21504 | 1.042 |
| 17.21652 | 1.042 |
| 17.21742 | 1.042 |
| 17.21832 | 1.042 |
| 17.24709 | 1.042 |
| 17.2482 | 1.042 |
| 17.24909 | 1.042 |
| 17.28056 | 1.042 |
| 17.28166 | 1.042 |
| 17.28265 | 1.042 |
| 17.28377 | 1.042 |
| 17.31359 | 1.042 |
| 17.31463 | 1.042 |
| 17.31568 | 1.042 |
| 17.34547 | 1.042 |
| 17.34672 | 1.042 |
| 17.3477 | 1.042 |
| 17.37674 | 1.042 |
| 17.37827 | 1.042 |
| 17.37936 | 1.042 |
| 17.40431 | 1.042 |
| 17.40565 | 1.042 |
| 17.40679 | 1.042 |
| 17.4344 | 1 |
| 17.4355 | 1 |
| 17.43663 | 1.042 |
| 17.46178 | 1.042 |
| 17.4629 | 1.042 |
| 17.48032 | 1.042 |
| 17.48134 | 1.042 |
| 17.51286 | 1 |
| 17.51394 | 1 |
| 17.51485 | 1 |
| 17.54203 | 1 |
| 17.54318 | 1 |
| 17.54409 | 1 |
| 17.57543 | 1 |
| 17.57699 | 1 |
| 17.5779 | 1 |
| 17.57889 | 1 |
| 17.60789 | 1 |
| 17.60896 | 1 |
| 17.61276 | 1 |
| 17.6407 | 1 |
| 17.64181 | 1 |
| 17.64274 | 1 |
| 17.65567 | 0.958 |
| 17.68596 | 0.958 |
| 17.68703 | 0.958 |
| 17.68839 | 0.958 |
| 17.69002 | 0.958 |
| 17.7229 | 0.958 |
| 17.72457 | 0.958 |
| 17.72585 | 0.958 |
| 17.75654 | 0.958 |
| 17.7577 | 0.958 |
| 17.75869 | 0.958 |
| 17.7596 | 0.958 |
| 17.78838 | 0.958 |
| 17.78947 | 0.958 |
| 17.79138 | 0.958 |
| 17.81928 | 0.958 |
| 17.82042 | 0.958 |
| 17.82142 | 0.958 |
| 17.84951 | 0.958 |
| 17.85059 | 0.958 |
| 17.85516 | 0.958 |
| 17.88467 | 0.958 |
| 17.8858 | 0.958 |
| 17.88672 | 0.958 |
| 17.9158 | 0.958 |
| 17.91691 | 0.958 |
| 17.91924 | 0.958 |
| 17.94739 | 0.958 |
| 17.94851 | 0.958 |
| 17.94942 | 0.958 |
| 17.96834 | 0.958 |
| 17.96937 | 0.958 |
| 17.99778 | 0.958 |
| 17.99893 | 0.958 |
| 17.99986 | 0.958 |
| 18.02869 | 1 |
| 18.02987 | 1 |
| 18.05962 | 1 |
| 18.06074 | 0.958 |
| 18.06178 | 0.958 |
| 18.07707 | 1 |
| 18.1069 | 1 |
| 18.11167 | 1 |
| 18.11609 | 1 |
| 18.14256 | 1 |
| 18.14651 | 1 |
| 18.14762 | 1 |
| 18.17531 | 1 |
| 18.17634 | 1 |
| 18.20501 | 1 |
| 18.20609 | 1 |
| 18.20787 | 1 |
| 18.20984 | 1 |
| 18.24048 | 1.042 |
| 18.2416 | 1.042 |
| 18.24253 | 1.042 |
| 18.24901 | 1 |
| 18.27458 | 1.042 |
| 18.27572 | 1.042 |
| 18.29004 | 1.042 |
| 18.29109 | 1.042 |
| 18.32685 | 1.042 |
| 18.32794 | 1.042 |
| 18.32887 | 1.042 |
| 18.34386 | 1.042 |
| 18.3452 | 1.042 |
| 18.3736 | 1.042 |
| 18.37471 | 1.042 |
| 18.37564 | 1.042 |
| 18.40384 | 1.042 |
| 18.40497 | 1.042 |
| 18.40591 | 1.042 |
| 18.43452 | 1.042 |
| 18.43588 | 1.042 |
| 18.43681 | 1.042 |
| 18.46625 | 1.042 |
| 18.46749 | 1.042 |
| 18.46842 | 1.042 |
| 18.49832 | 1.042 |
| 18.49937 | 1.042 |
| 18.50033 | 1.042 |
| 18.50629 | 1.042 |
| 18.53412 | 1.042 |
| 18.53536 | 1.042 |
| 18.5363 | 1.042 |
| 18.56589 | 1.042 |
| 18.56702 | 1.042 |
| 18.56804 | 1 |
| 18.59588 | 1 |
| 18.59702 | 1 |
| 18.63341 | 1 |
| 18.63519 | 1 |
| 18.63675 | 1 |
| 18.63868 | 1 |
| 18.643 | 1 |
| 18.6697 | 1 |
| 18.67081 | 1 |
| 18.67174 | 1 |
| 18.68068 | 1 |
| 18.71483 | 1 |
| 18.71596 | 1 |
| 18.71692 | 1 |
| 18.72738 | 1 |
| 18.73109 | 1 |
| 18.75622 | 0.958 |
| 18.75739 | 0.958 |
| 18.76113 | 0.958 |
| 18.78637 | 0.958 |
| 18.79057 | 0.958 |
| 18.81659 | 1 |
| 18.81769 | 1 |
| 18.81863 | 1 |
| 18.81974 | 0.958 |
| 18.84538 | 0.958 |
| 18.84648 | 0.958 |
| 18.87299 | 0.958 |
| 18.87439 | 0.958 |
| 18.87537 | 0.958 |
| 18.90305 | 0.958 |
| 18.90423 | 0.958 |
| 18.90529 | 0.958 |
| 18.93389 | 0.958 |
| 18.935 | 0.958 |
| 18.93597 | 0.958 |
| 18.96985 | 0.958 |
| 18.97092 | 0.958 |
| 18.97187 | 0.958 |
| 18.98831 | 0.958 |
| 18.98951 | 0.958 |
| 19.01711 | 0.958 |
| 19.01824 | 0.958 |
| 19.01918 | 0.958 |
| 19.04811 | 0.958 |
| 19.04981 | 0.958 |
| 19.05126 | 0.958 |
| 19.05519 | 0.958 |
| 19.08105 | 1 |
| 19.0822 | 1 |
| 19.11229 | 0.958 |
| 19.11344 | 0.958 |
| 19.11439 | 0.958 |
| 19.11818 | 0.958 |
| 19.14324 | 0.958 |
| 19.17122 | 0.958 |
| 19.17236 | 0.958 |
| 19.17329 | 0.958 |
| 19.19849 | 1 |
| 19.22394 | 1 |
| 19.25064 | 1 |
| 19.25178 | 1 |
| 19.25272 | 1 |
| 19.27857 | 1 |
| 19.30513 | 1 |
| 19.30621 | 1 |
| 19.30717 | 1 |
| 19.31183 | 1 |
| 19.33977 | 1 |
| 19.34092 | 1 |
| 19.34404 | 1 |
| 19.37231 | 1.042 |
| 19.40812 | 1.042 |
| 19.40918 | 1.042 |
| 19.41013 | 1.042 |
| 19.41124 | 1.042 |
| 19.41255 | 1.042 |
| 19.44552 | 1.042 |
| 19.44705 | 1.042 |
| 19.44813 | 1.042 |
| 19.45828 | 1.042 |
| 19.46489 | 1.042 |
| 19.49006 | 1.042 |
| 19.49123 | 1.042 |
| 19.49517 | 1.042 |
| 19.52372 | 1.042 |
| 19.52485 | 1.042 |
| 19.52611 | 1.042 |
| 19.55329 | 1.042 |
| 19.55442 | 1.042 |
| 19.58115 | 1.042 |
| 19.58224 | 1.042 |
| 19.5832 | 1.042 |
| 19.61179 | 1.042 |
| 19.61295 | 1.042 |
| 19.61395 | 1.042 |
| 19.64262 | 1.042 |
| 19.64379 | 1.042 |
| 19.64475 | 1.042 |
| 19.67387 | 1 |
| 19.67517 | 1 |
| 19.67615 | 1 |
| 19.68024 | 1 |
| 19.70675 | 1 |
| 19.70792 | 1 |
| 19.71 | 1 |
| 19.73632 | 1.042 |
| 19.73781 | 1 |
| 19.7389 | 1 |
| 19.76734 | 1 |
| 19.76845 | 1 |
| 19.77256 | 1 |
| 19.79782 | 1 |
| 19.79896 | 1 |
| 19.82402 | 1 |
| 19.82519 | 1 |
| 19.82615 | 1 |
| 19.83044 | 1 |
| 19.85881 | 1 |
| 19.89421 | 1 |
| 19.92869 | 0.958 |
| 19.92986 | 0.958 |
| 19.93082 | 0.958 |
| 19.93478 | 1 |
| 19.96522 | 0.958 |
| 19.9664 | 0.958 |
| 19.96737 | 0.958 |
| 19.99654 | 1 |
| 19.99761 | 1 |
| 19.99861 | 1 |
| 20.02977 | 0.958 |
| 20.03091 | 0.958 |
| 20.03188 | 0.958 |
| 20.03573 | 0.958 |
| 20.06097 | 0.958 |
| 20.06219 | 0.958 |
| 20.08765 | 0.958 |
| 20.08883 | 0.958 |
| 20.0898 | 0.958 |
| 20.12111 | 0.958 |
| 20.12226 | 0.958 |
| 20.12969 | 0.958 |
| 20.13078 | 0.958 |
| 20.16148 | 0.958 |
| 20.1626 | 0.958 |
| 20.16374 | 0.958 |
| 20.19483 | 0.958 |
| 20.19613 | 0.958 |
| 20.20003 | 0.958 |
| 20.22592 | 0.958 |
| 20.22705 | 0.958 |
| 20.22802 | 0.958 |